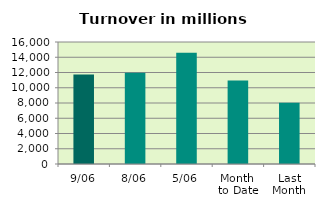
| Category | Series 0 |
|---|---|
| 9/06 | 11737.409 |
| 8/06 | 11969.164 |
| 5/06 | 14579.301 |
| Month 
to Date | 10946.885 |
| Last
Month | 8023.22 |